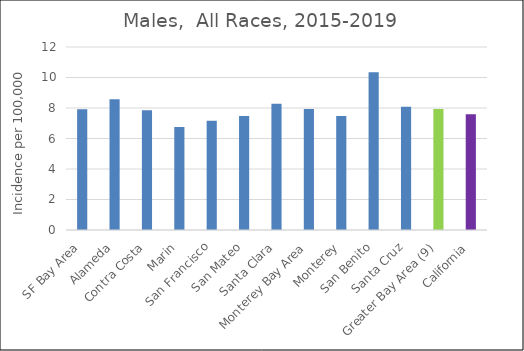
| Category | Male |
|---|---|
| SF Bay Area | 7.92 |
|   Alameda | 8.57 |
|   Contra Costa | 7.86 |
|   Marin | 6.76 |
|   San Francisco | 7.16 |
|   San Mateo | 7.47 |
|   Santa Clara | 8.28 |
| Monterey Bay Area | 7.93 |
|   Monterey | 7.48 |
|   San Benito | 10.34 |
|   Santa Cruz | 8.08 |
| Greater Bay Area (9) | 7.93 |
| California | 7.59 |